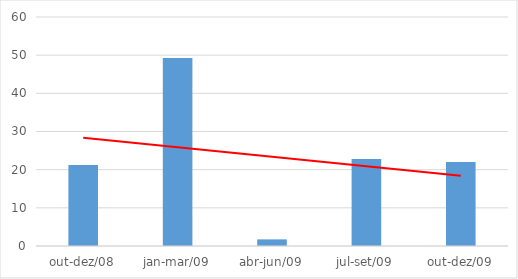
| Category | Series 0 |
|---|---|
| out-dez/08 | 21.223 |
| jan-mar/09 | 49.253 |
| abr-jun/09 | 1.734 |
| jul-set/09 | 22.77 |
| out-dez/09 | 22.024 |